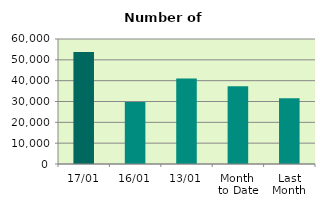
| Category | Series 0 |
|---|---|
| 17/01 | 53804 |
| 16/01 | 29730 |
| 13/01 | 41016 |
| Month 
to Date | 37263.5 |
| Last
Month | 31517.905 |